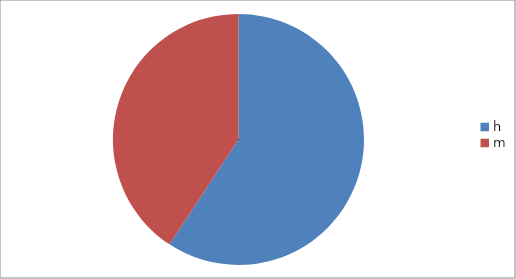
| Category | Series 0 |
|---|---|
| h | 16 |
| m | 11 |